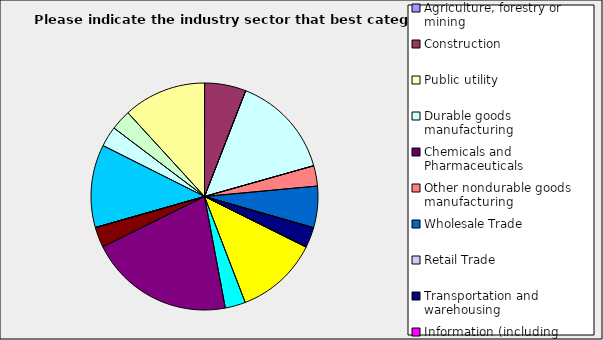
| Category | Series 0 |
|---|---|
| Agriculture, forestry or mining | 0 |
| Construction | 0.059 |
| Public utility | 0 |
| Durable goods manufacturing | 0.147 |
| Chemicals and Pharmaceuticals | 0 |
| Other nondurable goods manufacturing | 0.029 |
| Wholesale Trade | 0.059 |
| Retail Trade | 0 |
| Transportation and warehousing | 0.029 |
| Information (including broadcasting and telecommunication) | 0 |
| Finance and Insurance | 0.118 |
| Real Estate | 0.029 |
| Professional, scientific and technical services | 0.206 |
| Consulting | 0.029 |
| Administrative and office services (including waste management) | 0 |
| Education | 0 |
| Health Care and social services | 0.118 |
| Arts, entertainment and recreation | 0.029 |
| Accommodation and food services | 0.029 |
| Other | 0.118 |